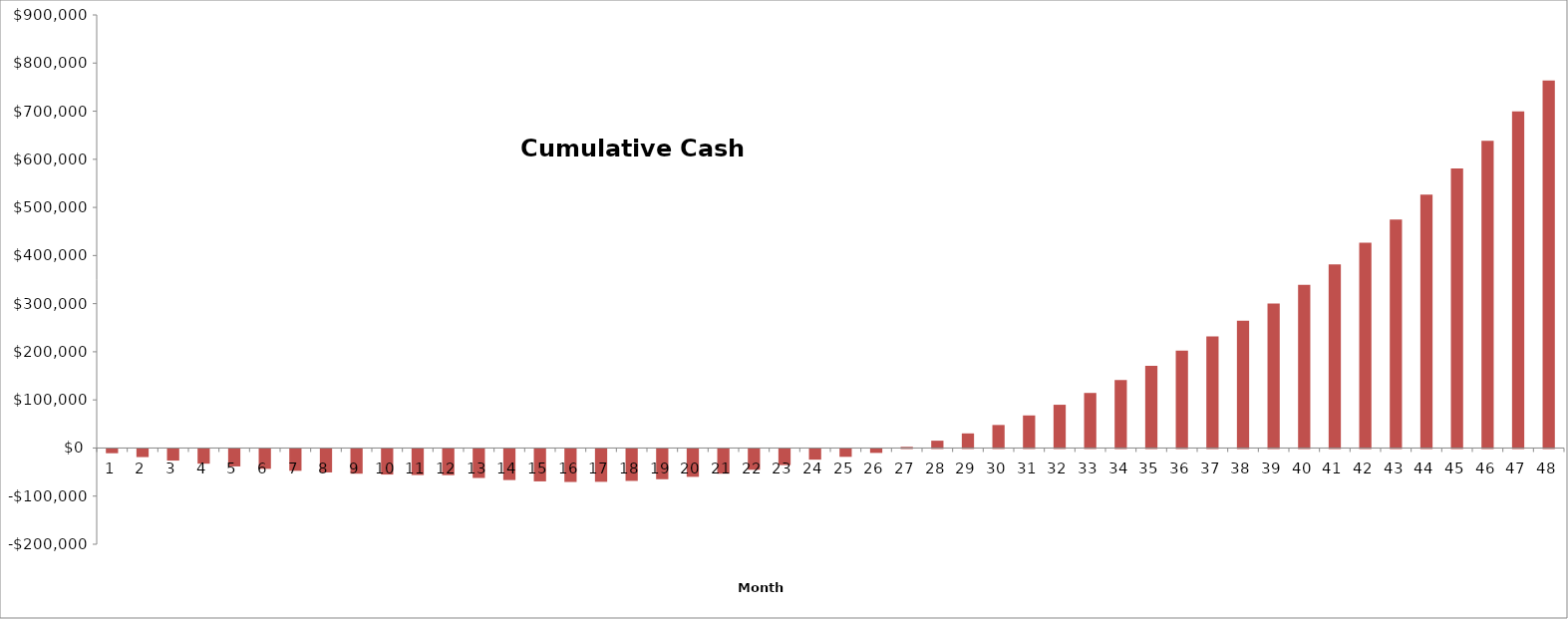
| Category | Monthly Cumulative Cash Flow |
|---|---|
| 0 | -8773.003 |
| 1 | -16779.948 |
| 2 | -24020.833 |
| 3 | -30495.66 |
| 4 | -36204.427 |
| 5 | -41147.135 |
| 6 | -45305.556 |
| 7 | -48679.687 |
| 8 | -51269.531 |
| 9 | -53075.087 |
| 10 | -54096.354 |
| 11 | -54333.333 |
| 12 | -60205.078 |
| 13 | -64526.476 |
| 14 | -67297.526 |
| 15 | -68518.229 |
| 16 | -68188.585 |
| 17 | -66308.594 |
| 18 | -62860.026 |
| 19 | -57842.882 |
| 20 | -51257.161 |
| 21 | -43102.865 |
| 22 | -33379.991 |
| 23 | -22088.542 |
| 24 | -16269.531 |
| 25 | -8115.885 |
| 26 | 2372.396 |
| 27 | 15195.312 |
| 28 | 30352.865 |
| 29 | 47845.052 |
| 30 | 67690.104 |
| 31 | 89888.021 |
| 32 | 114438.802 |
| 33 | 141342.448 |
| 34 | 170598.958 |
| 35 | 202208.333 |
| 36 | 231804.47 |
| 37 | 264519.531 |
| 38 | 300353.516 |
| 39 | 339306.424 |
| 40 | 381378.255 |
| 41 | 426569.01 |
| 42 | 474896.918 |
| 43 | 526361.979 |
| 44 | 580964.193 |
| 45 | 638703.559 |
| 46 | 699580.078 |
| 47 | 763593.75 |